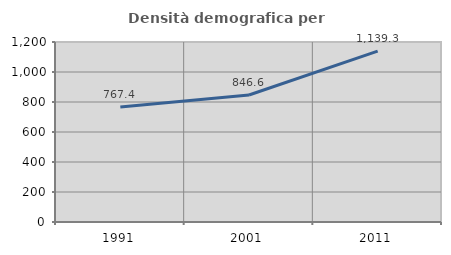
| Category | Densità demografica |
|---|---|
| 1991.0 | 767.403 |
| 2001.0 | 846.556 |
| 2011.0 | 1139.318 |